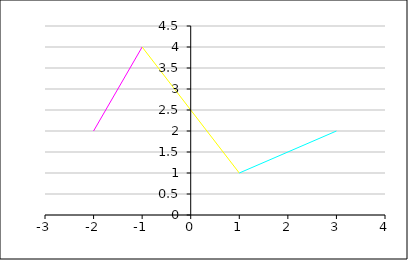
| Category | Series 1 |
|---|---|
| -2.0 | 2 |
| -1.0 | 4 |
| 1.0 | 1 |
| 3.0 | 2 |